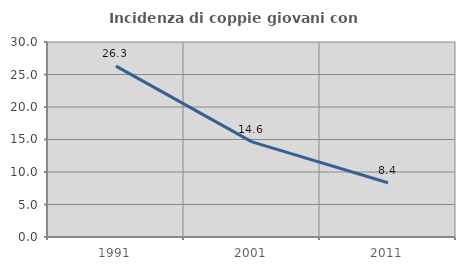
| Category | Incidenza di coppie giovani con figli |
|---|---|
| 1991.0 | 26.289 |
| 2001.0 | 14.634 |
| 2011.0 | 8.353 |